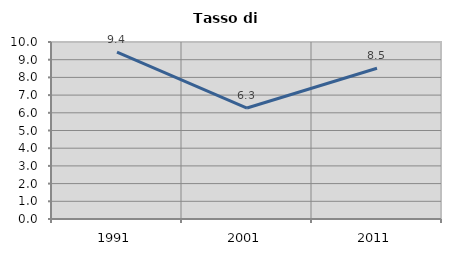
| Category | Tasso di disoccupazione   |
|---|---|
| 1991.0 | 9.433 |
| 2001.0 | 6.268 |
| 2011.0 | 8.517 |